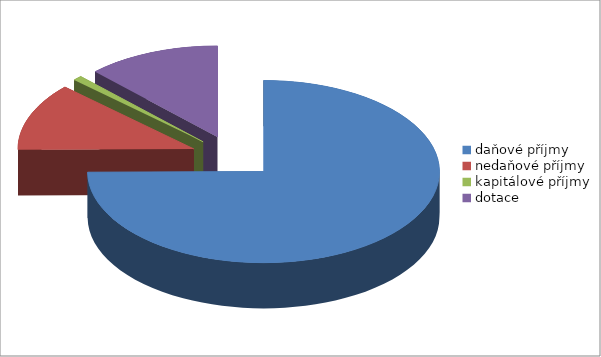
| Category | Series 0 |
|---|---|
| daňové příjmy | 6216584 |
| nedaňové příjmy | 997467 |
| kapitálové příjmy | 70405 |
| dotace | 1017033 |